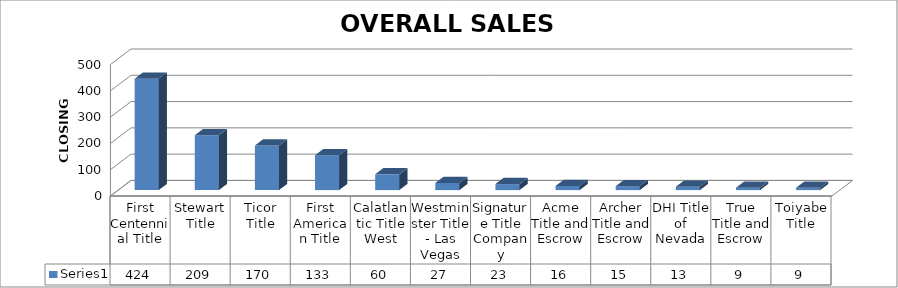
| Category | Series 0 |
|---|---|
| First Centennial Title | 424 |
| Stewart Title | 209 |
| Ticor Title | 170 |
| First American Title | 133 |
| Calatlantic Title West | 60 |
| Westminster Title - Las Vegas | 27 |
| Signature Title Company | 23 |
| Acme Title and Escrow | 16 |
| Archer Title and Escrow | 15 |
| DHI Title of Nevada | 13 |
| True Title and Escrow | 9 |
| Toiyabe Title | 9 |